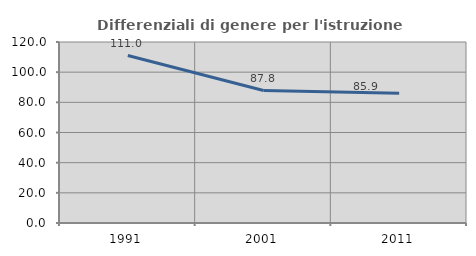
| Category | Differenziali di genere per l'istruzione superiore |
|---|---|
| 1991.0 | 111.047 |
| 2001.0 | 87.799 |
| 2011.0 | 85.949 |